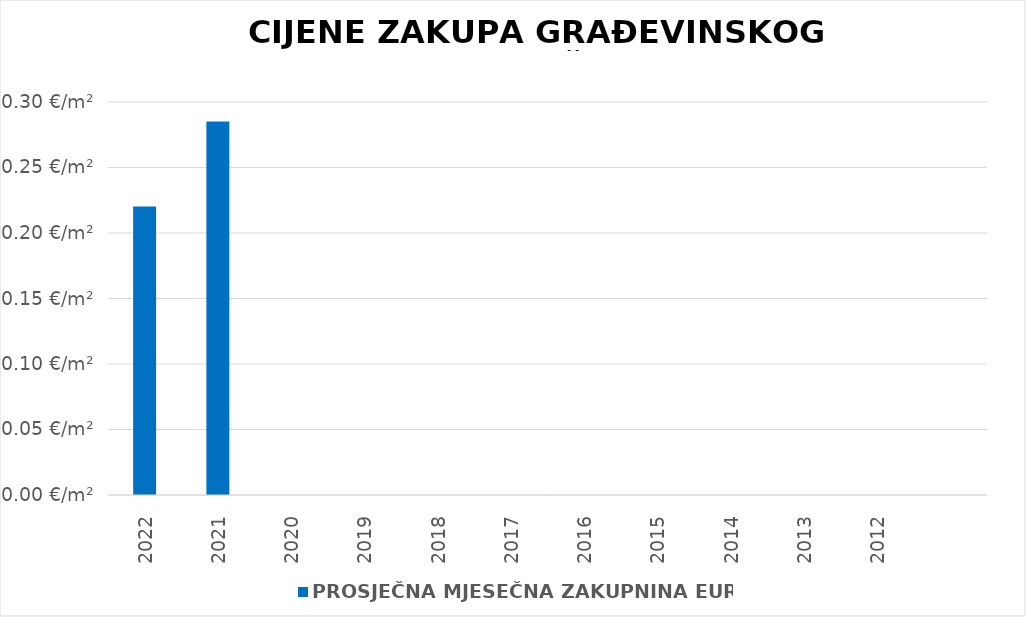
| Category | PROSJEČNA MJESEČNA ZAKUPNINA EUR/m2 |
|---|---|
| 2022 | 0.22 |
| 2021 | 0.285 |
| 2020 | 0 |
| 2019 | 0 |
| 2018 | 0 |
| 2017 | 0 |
| 2016 | 0 |
| 2015 | 0 |
| 2014 | 0 |
| 2013 | 0 |
| 2012 | 0 |